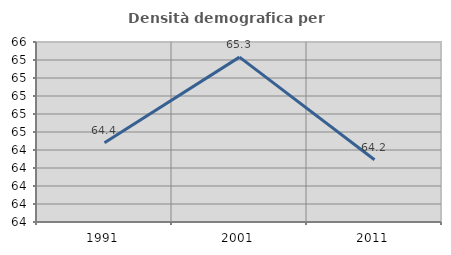
| Category | Densità demografica |
|---|---|
| 1991.0 | 64.381 |
| 2001.0 | 65.332 |
| 2011.0 | 64.191 |